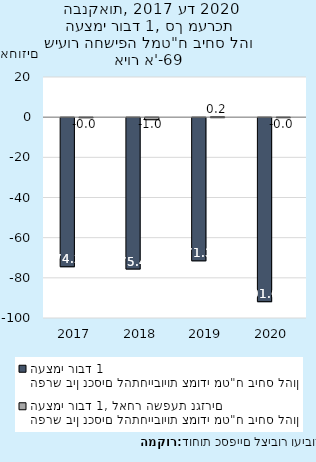
| Category | הפרש בין נכסים להתחייבויות צמודי מט"ח ביחס להון העצמי רובד 1 | הפרש בין נכסים להתחייבויות צמודי מט"ח ביחס להון העצמי רובד 1, לאחר השפעת נגזרים |
|---|---|---|
| 2017-12-31 | -74.228 | -0.035 |
| 2018-12-31 | -75.377 | -1.028 |
| 2019-12-31 | -71.293 | 0.165 |
| 2020-12-31 | -91.621 | -0.012 |